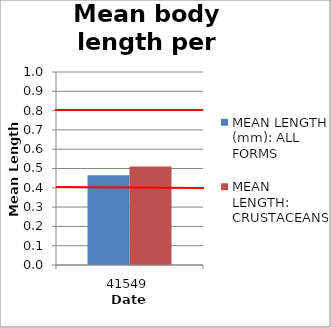
| Category | MEAN LENGTH (mm): ALL FORMS | MEAN LENGTH: CRUSTACEANS |
|---|---|---|
| 41549.0 | 0.465 | 0.51 |